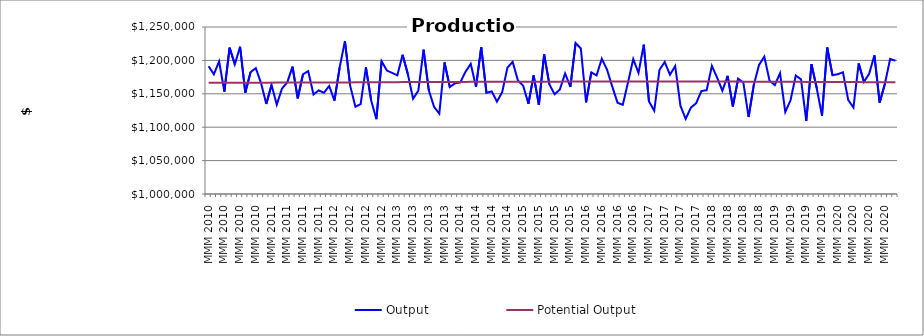
| Category | Output | Potential Output |
|---|---|---|
| MMM 2010 | 1191258.667 | 1166666.667 |
| MMM 2010 | 1179163.815 | 1166666.667 |
| MMM 2010 | 1198502.595 | 1166666.18 |
| MMM 2010 | 1153400.953 | 1166659.56 |
| MMM 2010 | 1219000.463 | 1166662.577 |
| MMM 2010 | 1194071.692 | 1166676.691 |
| MMM 2010 | 1220436.627 | 1166679.804 |
| MMM 2010 | 1151827.209 | 1166684.097 |
| MMM 2010 | 1182425.328 | 1166686.357 |
| MMM 2010 | 1188440.061 | 1166690.272 |
| MMM 2010 | 1165962.766 | 1166698.7 |
| MMM 2010 | 1134755.126 | 1166707.954 |
| MMM 2011 | 1163285.327 | 1166719.836 |
| MMM 2011 | 1133772.351 | 1166734.754 |
| MMM 2011 | 1157917.929 | 1166745.854 |
| MMM 2011 | 1167102.41 | 1166766.305 |
| MMM 2011 | 1190691.17 | 1166778.585 |
| MMM 2011 | 1143080.836 | 1166796.804 |
| MMM 2011 | 1179199.198 | 1166824.588 |
| MMM 2011 | 1183906.136 | 1166863.269 |
| MMM 2011 | 1148976.406 | 1166888.82 |
| MMM 2011 | 1155145.88 | 1166914.728 |
| MMM 2011 | 1151556.766 | 1166948.098 |
| MMM 2011 | 1161748.419 | 1166969.94 |
| MMM 2012 | 1139715.734 | 1166994.828 |
| MMM 2012 | 1189485.764 | 1167018.863 |
| MMM 2012 | 1228964.958 | 1167048.152 |
| MMM 2012 | 1162229.466 | 1167083.986 |
| MMM 2012 | 1130678.126 | 1167122.415 |
| MMM 2012 | 1134529.93 | 1167168.052 |
| MMM 2012 | 1189466.117 | 1167220.671 |
| MMM 2012 | 1140426.347 | 1167270.653 |
| MMM 2012 | 1111958.239 | 1167315.716 |
| MMM 2012 | 1198783.98 | 1167355.596 |
| MMM 2012 | 1184811.704 | 1167401.014 |
| MMM 2012 | 1181283.502 | 1167438.322 |
| MMM 2013 | 1177637.545 | 1167474.74 |
| MMM 2013 | 1208385.118 | 1167507.419 |
| MMM 2013 | 1179602.322 | 1167538.057 |
| MMM 2013 | 1142635.251 | 1167567.996 |
| MMM 2013 | 1154620.646 | 1167589.502 |
| MMM 2013 | 1216009.166 | 1167612.998 |
| MMM 2013 | 1155175.195 | 1167633.969 |
| MMM 2013 | 1130593.975 | 1167657.703 |
| MMM 2013 | 1120295.718 | 1167685.058 |
| MMM 2013 | 1197033.964 | 1167713.025 |
| MMM 2013 | 1160044.764 | 1167750.286 |
| MMM 2013 | 1165761.26 | 1167780.492 |
| MMM 2014 | 1167047.188 | 1167802.699 |
| MMM 2014 | 1182900.075 | 1167833.713 |
| MMM 2014 | 1194853.195 | 1167874.055 |
| MMM 2014 | 1160361.111 | 1167907.584 |
| MMM 2014 | 1219950.327 | 1167934.639 |
| MMM 2014 | 1151502.027 | 1167963.186 |
| MMM 2014 | 1153609.985 | 1167983.026 |
| MMM 2014 | 1138282.952 | 1167997.998 |
| MMM 2014 | 1152538.978 | 1168011.767 |
| MMM 2014 | 1189136.82 | 1168021.205 |
| MMM 2014 | 1197817.493 | 1168039.885 |
| MMM 2014 | 1169752.845 | 1168052.187 |
| MMM 2015 | 1162160.585 | 1168073.102 |
| MMM 2015 | 1135112.918 | 1168083.542 |
| MMM 2015 | 1177387.698 | 1168100.132 |
| MMM 2015 | 1133466.504 | 1168125.825 |
| MMM 2015 | 1209081.925 | 1168149.295 |
| MMM 2015 | 1164025.8 | 1168166.242 |
| MMM 2015 | 1149332.545 | 1168194.599 |
| MMM 2015 | 1156411.124 | 1168216.086 |
| MMM 2015 | 1180463.436 | 1168243.963 |
| MMM 2015 | 1160364.673 | 1168274.868 |
| MMM 2015 | 1225962.408 | 1168313.607 |
| MMM 2015 | 1217776.084 | 1168349.321 |
| MMM 2016 | 1137176.959 | 1168376.162 |
| MMM 2016 | 1182098.684 | 1168403.415 |
| MMM 2016 | 1177517.157 | 1168426.93 |
| MMM 2016 | 1202460.169 | 1168446.469 |
| MMM 2016 | 1186098.009 | 1168462.475 |
| MMM 2016 | 1160698.942 | 1168476.312 |
| MMM 2016 | 1136627.45 | 1168494.645 |
| MMM 2016 | 1133473.938 | 1168508.435 |
| MMM 2016 | 1167190.011 | 1168515.697 |
| MMM 2016 | 1201944.063 | 1168516.095 |
| MMM 2016 | 1181246.179 | 1168515.617 |
| MMM 2016 | 1223522.405 | 1168507.95 |
| MMM 2017 | 1138554.916 | 1168505.805 |
| MMM 2017 | 1124652.927 | 1168506.426 |
| MMM 2017 | 1185712.483 | 1168498.462 |
| MMM 2017 | 1197710.661 | 1168481.222 |
| MMM 2017 | 1178515.593 | 1168458.888 |
| MMM 2017 | 1191495.501 | 1168433.97 |
| MMM 2017 | 1132065.232 | 1168405.739 |
| MMM 2017 | 1112490.057 | 1168377.573 |
| MMM 2017 | 1129407.492 | 1168355.689 |
| MMM 2017 | 1135934.071 | 1168337.576 |
| MMM 2017 | 1154140.614 | 1168324.089 |
| MMM 2017 | 1155443.701 | 1168307.645 |
| MMM 2018 | 1191811.027 | 1168291.617 |
| MMM 2018 | 1174121.652 | 1168282.799 |
| MMM 2018 | 1154576.677 | 1168276.852 |
| MMM 2018 | 1176946.693 | 1168273.38 |
| MMM 2018 | 1130976.255 | 1168259.954 |
| MMM 2018 | 1172721.457 | 1168237.878 |
| MMM 2018 | 1166787.515 | 1168213.556 |
| MMM 2018 | 1115300.511 | 1168191.565 |
| MMM 2018 | 1163648.724 | 1168163.813 |
| MMM 2018 | 1193327.314 | 1168130.744 |
| MMM 2018 | 1205610.137 | 1168100.15 |
| MMM 2018 | 1169566.183 | 1168071.406 |
| MMM 2019 | 1163036.061 | 1168048.188 |
| MMM 2019 | 1180818.878 | 1168013.478 |
| MMM 2019 | 1122759.894 | 1167982.533 |
| MMM 2019 | 1140308.952 | 1167948.326 |
| MMM 2019 | 1177378.281 | 1167908.027 |
| MMM 2019 | 1171636.579 | 1167873.914 |
| MMM 2019 | 1109302.158 | 1167840.02 |
| MMM 2019 | 1194297.164 | 1167798.831 |
| MMM 2019 | 1158231.168 | 1167766.996 |
| MMM 2019 | 1117394.891 | 1167739.386 |
| MMM 2019 | 1219302.931 | 1167703.821 |
| MMM 2019 | 1177828.364 | 1167671.894 |
| MMM 2020 | 1179295.789 | 1167641.87 |
| MMM 2020 | 1182225.253 | 1167619.478 |
| MMM 2020 | 1140875.57 | 1167588.619 |
| MMM 2020 | 1129378.436 | 1167550.368 |
| MMM 2020 | 1195513.655 | 1167515.632 |
| MMM 2020 | 1167834.143 | 1167474.333 |
| MMM 2020 | 1179982.792 | 1167442.671 |
| MMM 2020 | 1207665.195 | 1167408.72 |
| MMM 2020 | 1136763.385 | 1167364.505 |
| MMM 2020 | 1164951.128 | 1167323.68 |
| MMM 2020 | 1202217.488 | 1167273.133 |
| MMM 2020 | 1199513.687 | 1167230.829 |